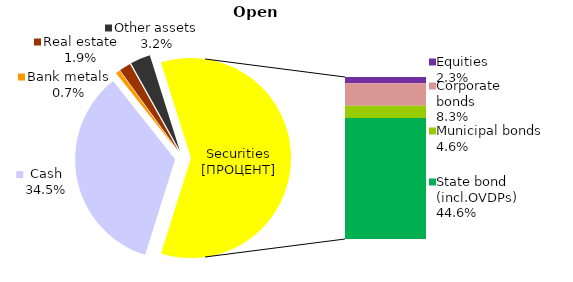
| Category | Open |
|---|---|
| Cash | 527.633 |
| Bank metals | 10.485 |
| Real estate | 28.596 |
| Other assets | 49.695 |
| Equities | 34.851 |
| Corporate bonds | 126.751 |
| Municipal bonds | 70.211 |
| State bond (incl.OVDPs) | 681.833 |